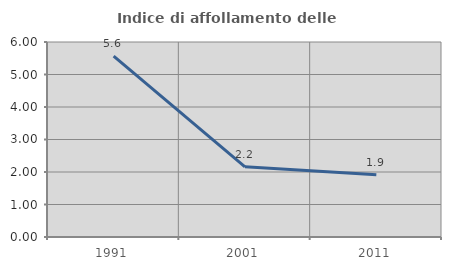
| Category | Indice di affollamento delle abitazioni  |
|---|---|
| 1991.0 | 5.566 |
| 2001.0 | 2.161 |
| 2011.0 | 1.917 |